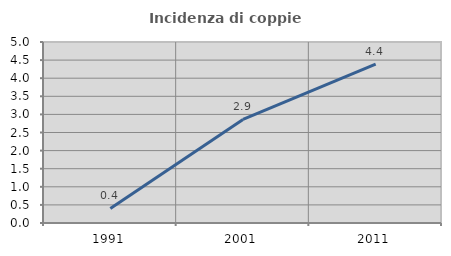
| Category | Incidenza di coppie miste |
|---|---|
| 1991.0 | 0.402 |
| 2001.0 | 2.862 |
| 2011.0 | 4.387 |